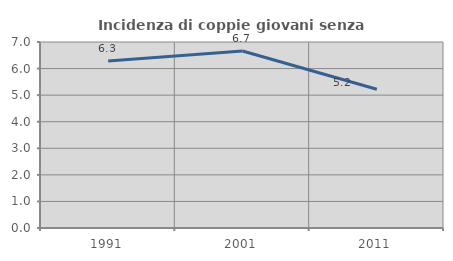
| Category | Incidenza di coppie giovani senza figli |
|---|---|
| 1991.0 | 6.287 |
| 2001.0 | 6.661 |
| 2011.0 | 5.221 |